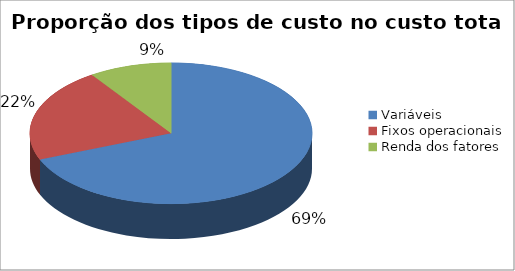
| Category | Series 0 |
|---|---|
| Variáveis | 74175.137 |
| Fixos operacionais | 23233.601 |
| Renda dos fatores | 10179.749 |